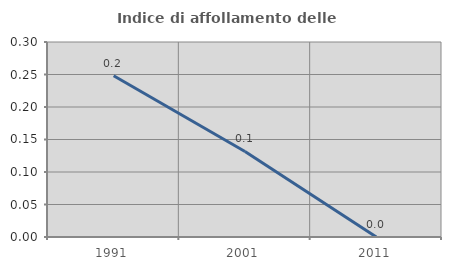
| Category | Indice di affollamento delle abitazioni  |
|---|---|
| 1991.0 | 0.248 |
| 2001.0 | 0.132 |
| 2011.0 | 0 |